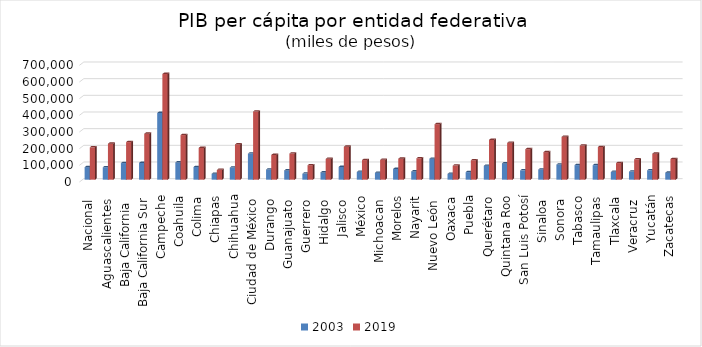
| Category | 2003 | 2019 |
|---|---|---|
| Nacional  | 75141.499 | 194187.06 |
| Aguascalientes  | 74531 | 215988 |
| Baja California  | 99679 | 225537 |
| Baja California Sur | 100464 | 275935 |
| Campeche | 400346 | 634351 |
| Coahuila | 103518 | 267678 |
| Colima | 76052 | 190603 |
| Chiapas | 35467 | 58798 |
| Chihuahua | 72882 | 211679 |
| Ciudad de México  | 156617 | 409040 |
| Durango  | 60812 | 148453 |
| Guanajuato  | 55560 | 157015 |
| Guerrero  | 36354 | 86638 |
| Hidalgo  | 43618 | 125166 |
| Jalisco  | 76416 | 197767 |
| México | 46984 | 117743 |
| Michoacan  | 41700 | 119225 |
| Morelos | 64259 | 125985 |
| Nayarit | 49330 | 128355 |
| Nuevo León  | 125677 | 332827 |
| Oaxaca | 35183 | 84681 |
| Puebla | 45454 | 116661 |
| Querétaro | 83531 | 238546 |
| Quintana Roo | 97755 | 221190 |
| San Luis Potosí | 55912 | 182907 |
| Sinaloa  | 60961 | 165144 |
| Sonora  | 90919 | 257357 |
| Tabasco | 87513 | 204863 |
| Tamaulipas | 87364 | 196193 |
| Tlaxcala | 46796 | 99624 |
| Veracruz  | 48558 | 122325 |
| Yucatán | 56101 | 155894 |
| Zacatecas | 41972 | 124211 |